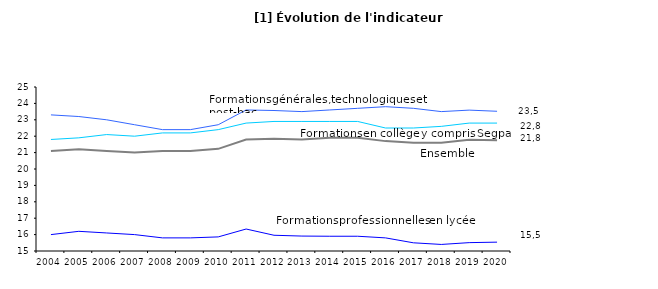
| Category | Formations en collège y compris Segpa | Formations professionnelles en lycée | Formations générales et technologiques et post-bac en lycée | Ensemble |
|---|---|---|---|---|
| 2004.0 | 21.8 | 16 | 23.3 | 21.1 |
| 2005.0 | 21.9 | 16.2 | 23.2 | 21.2 |
| 2006.0 | 22.1 | 16.1 | 23 | 21.1 |
| 2007.0 | 22 | 16 | 22.7 | 21 |
| 2008.0 | 22.2 | 15.8 | 22.4 | 21.1 |
| 2009.0 | 22.2 | 15.8 | 22.4 | 21.1 |
| 2010.0 | 22.4 | 15.86 | 22.7 | 21.23 |
| 2011.0 | 22.8 | 16.34 | 23.6 | 21.8 |
| 2012.0 | 22.9 | 15.96 | 23.567 | 21.85 |
| 2013.0 | 22.9 | 15.91 | 23.5 | 21.8 |
| 2014.0 | 22.9 | 15.9 | 23.6 | 21.9 |
| 2015.0 | 22.9 | 15.9 | 23.7 | 21.9 |
| 2016.0 | 22.5 | 15.8 | 23.8 | 21.7 |
| 2017.0 | 22.5 | 15.5 | 23.7 | 21.6 |
| 2018.0 | 22.6 | 15.4 | 23.5 | 21.6 |
| 2019.0 | 22.8 | 15.51 | 23.59 | 21.78 |
| 2020.0 | 22.8 | 15.54 | 23.52 | 21.76 |